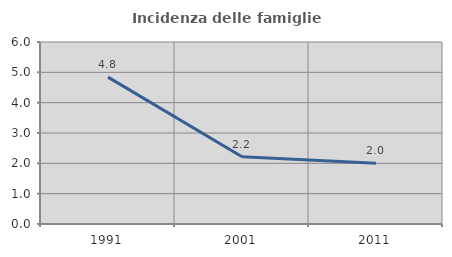
| Category | Incidenza delle famiglie numerose |
|---|---|
| 1991.0 | 4.842 |
| 2001.0 | 2.218 |
| 2011.0 | 2.005 |